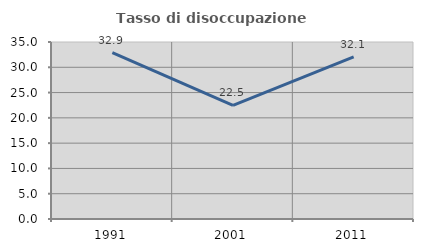
| Category | Tasso di disoccupazione giovanile  |
|---|---|
| 1991.0 | 32.883 |
| 2001.0 | 22.486 |
| 2011.0 | 32.063 |